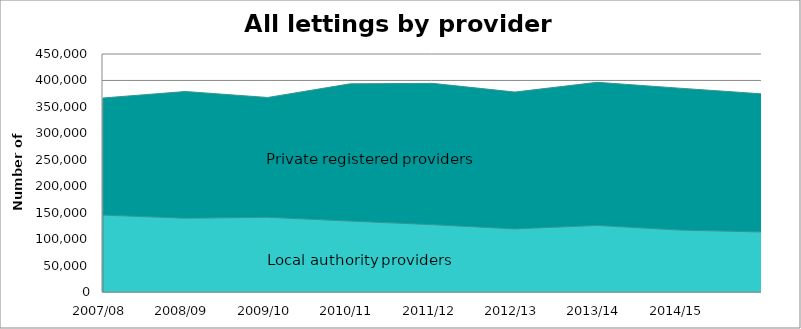
| Category | Series 1 | Series 0 |
|---|---|---|
| 0 | 145403 | 221417 |
| 1 | 139528 | 239554 |
| 2 | 141169 | 226586 |
| 3 | 134063 | 259562 |
| 4 | 127278 | 267206 |
| 5 | 119312 | 258731 |
| 6 | 125812 | 270659 |
| 7 | 117070 | 268273 |
| 8 | 113449 | 261163 |